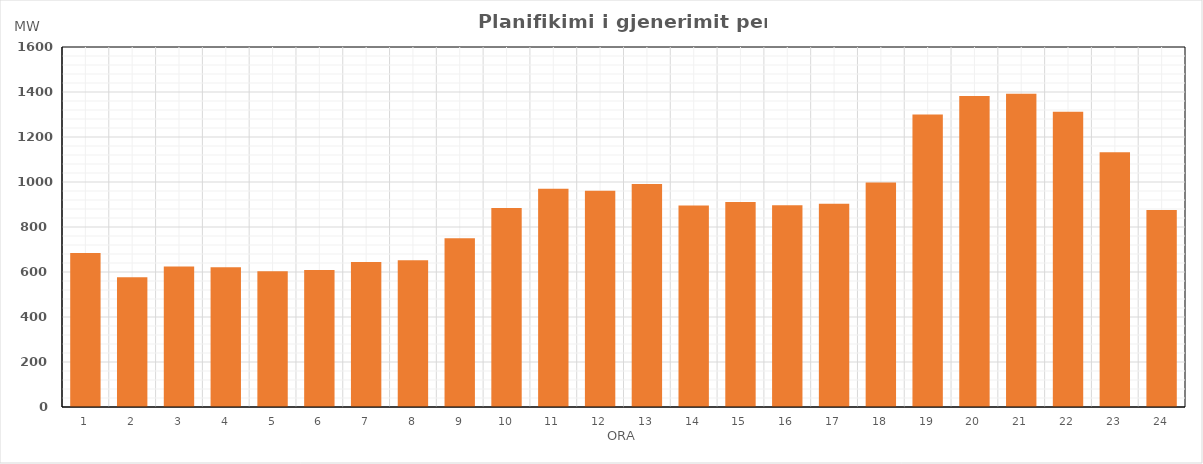
| Category | Max (MW) |
|---|---|
| 0 | 684.847 |
| 1 | 577.174 |
| 2 | 624.927 |
| 3 | 621.409 |
| 4 | 603.616 |
| 5 | 608.939 |
| 6 | 644.38 |
| 7 | 652.232 |
| 8 | 749.923 |
| 9 | 884.801 |
| 10 | 970.485 |
| 11 | 961.307 |
| 12 | 991.289 |
| 13 | 895.393 |
| 14 | 911.5 |
| 15 | 897.025 |
| 16 | 903.453 |
| 17 | 997.651 |
| 18 | 1300.325 |
| 19 | 1382.083 |
| 20 | 1392.567 |
| 21 | 1312.409 |
| 22 | 1132.52 |
| 23 | 875.011 |